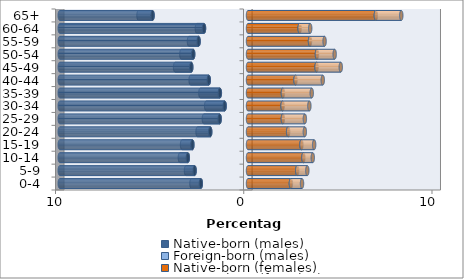
| Category | Native-born (males) | Foreign-born (males) | Native-born (females) | Foreign-born (females) |
|---|---|---|---|---|
| 0-4 | -2.505 | -0.498 | 2.279 | 0.591 |
| 5-9 | -2.836 | -0.458 | 2.614 | 0.537 |
| 10-14 | -3.197 | -0.421 | 2.942 | 0.499 |
| 15-19 | -2.954 | -0.549 | 2.839 | 0.675 |
| 20-24 | -2.006 | -0.673 | 2.132 | 0.887 |
| 25-29 | -1.505 | -0.838 | 1.852 | 1.169 |
| 30-34 | -1.241 | -0.98 | 1.837 | 1.423 |
| 35-39 | -1.495 | -1.034 | 1.854 | 1.532 |
| 40-44 | -2.083 | -0.964 | 2.523 | 1.449 |
| 45-49 | -3.013 | -0.859 | 3.642 | 1.286 |
| 50-54 | -2.911 | -0.628 | 3.663 | 0.942 |
| 55-59 | -2.623 | -0.513 | 3.293 | 0.775 |
| 60-64 | -2.337 | -0.379 | 2.742 | 0.562 |
| 65+ | -5.07 | -0.747 | 6.792 | 1.351 |